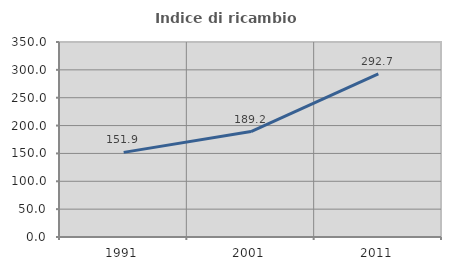
| Category | Indice di ricambio occupazionale  |
|---|---|
| 1991.0 | 151.875 |
| 2001.0 | 189.189 |
| 2011.0 | 292.727 |